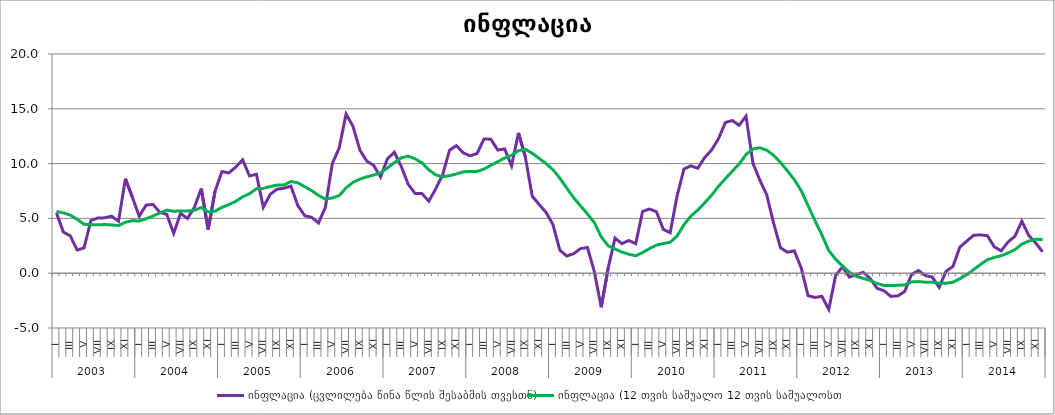
| Category | ინფლაცია (ცვლილება წინა წლის შესაბმის თვესთნ) | ინფლაცია (12 თვის საშუალო 12 თვის საშუალოსთნ) |
|---|---|---|
| 0 | 5.507 | 5.643 |
| 1 | 3.75 | 5.503 |
| 2 | 3.406 | 5.303 |
| 3 | 2.114 | 4.919 |
| 4 | 2.307 | 4.468 |
| 5 | 4.812 | 4.412 |
| 6 | 5.032 | 4.409 |
| 7 | 5.051 | 4.44 |
| 8 | 5.203 | 4.407 |
| 9 | 4.738 | 4.353 |
| 10 | 8.622 | 4.652 |
| 11 | 6.953 | 4.785 |
| 12 | 5.198 | 4.762 |
| 13 | 6.211 | 4.97 |
| 14 | 6.274 | 5.21 |
| 15 | 5.556 | 5.5 |
| 16 | 5.366 | 5.756 |
| 17 | 3.637 | 5.652 |
| 18 | 5.453 | 5.685 |
| 19 | 4.993 | 5.678 |
| 20 | 6.006 | 5.743 |
| 21 | 7.718 | 5.989 |
| 22 | 3.982 | 5.603 |
| 23 | 7.483 | 5.656 |
| 24 | 9.276 | 6.008 |
| 25 | 9.151 | 6.264 |
| 26 | 9.681 | 6.558 |
| 27 | 10.341 | 6.964 |
| 28 | 8.872 | 7.257 |
| 29 | 9.03 | 7.699 |
| 30 | 6.014 | 7.736 |
| 31 | 7.202 | 7.909 |
| 32 | 7.668 | 8.04 |
| 33 | 7.753 | 8.041 |
| 34 | 7.94 | 8.368 |
| 35 | 6.179 | 8.247 |
| 36 | 5.247 | 7.894 |
| 37 | 5.1 | 7.543 |
| 38 | 4.58 | 7.106 |
| 39 | 6.012 | 6.75 |
| 40 | 10 | 6.863 |
| 41 | 11.417 | 7.081 |
| 42 | 14.519 | 7.781 |
| 43 | 13.407 | 8.292 |
| 44 | 11.24 | 8.588 |
| 45 | 10.229 | 8.793 |
| 46 | 9.839 | 8.95 |
| 47 | 8.778 | 9.161 |
| 48 | 10.438 | 9.597 |
| 49 | 11.037 | 10.095 |
| 50 | 9.747 | 10.522 |
| 51 | 8.122 | 10.685 |
| 52 | 7.281 | 10.437 |
| 53 | 7.263 | 10.079 |
| 54 | 6.574 | 9.429 |
| 55 | 7.699 | 8.974 |
| 56 | 8.969 | 8.798 |
| 57 | 11.218 | 8.895 |
| 58 | 11.64 | 9.057 |
| 59 | 10.975 | 9.245 |
| 60 | 10.707 | 9.279 |
| 61 | 10.919 | 9.283 |
| 62 | 12.25 | 9.503 |
| 63 | 12.224 | 9.846 |
| 64 | 11.235 | 10.174 |
| 65 | 11.337 | 10.508 |
| 66 | 9.804 | 10.764 |
| 67 | 12.799 | 11.182 |
| 68 | 10.605 | 11.308 |
| 69 | 7.02 | 10.938 |
| 70 | 6.267 | 10.471 |
| 71 | 5.548 | 9.999 |
| 72 | 4.441 | 9.447 |
| 73 | 2.094 | 8.674 |
| 74 | 1.572 | 7.765 |
| 75 | 1.785 | 6.892 |
| 76 | 2.242 | 6.143 |
| 77 | 2.347 | 5.409 |
| 78 | 0.141 | 4.621 |
| 79 | -3.106 | 3.318 |
| 80 | 0.44 | 2.508 |
| 81 | 3.203 | 2.209 |
| 82 | 2.697 | 1.927 |
| 83 | 2.986 | 1.728 |
| 84 | 2.693 | 1.589 |
| 85 | 5.633 | 1.886 |
| 86 | 5.858 | 2.242 |
| 87 | 5.612 | 2.561 |
| 88 | 4.006 | 2.709 |
| 89 | 3.689 | 2.822 |
| 90 | 7.048 | 3.383 |
| 91 | 9.512 | 4.43 |
| 92 | 9.794 | 5.213 |
| 93 | 9.576 | 5.753 |
| 94 | 10.542 | 6.417 |
| 95 | 11.241 | 7.111 |
| 96 | 12.26 | 7.923 |
| 97 | 13.747 | 8.617 |
| 98 | 13.936 | 9.3 |
| 99 | 13.499 | 9.961 |
| 100 | 14.332 | 10.824 |
| 101 | 10.034 | 11.341 |
| 102 | 8.499 | 11.44 |
| 103 | 7.154 | 11.224 |
| 104 | 4.562 | 10.754 |
| 105 | 2.318 | 10.102 |
| 106 | 1.917 | 9.34 |
| 107 | 2.041 | 8.543 |
| 108 | 0.478 | 7.527 |
| 109 | -2.055 | 6.159 |
| 110 | -2.211 | 4.793 |
| 111 | -2.105 | 3.5 |
| 112 | -3.3 | 2.066 |
| 113 | -0.18 | 1.269 |
| 114 | 0.565 | 0.665 |
| 115 | -0.359 | 0.081 |
| 116 | -0.121 | -0.289 |
| 117 | 0.078 | -0.469 |
| 118 | -0.487 | -0.664 |
| 119 | -1.373 | -0.944 |
| 120 | -1.6 | -1.117 |
| 121 | -2.117 | -1.12 |
| 122 | -2.069 | -1.106 |
| 123 | -1.678 | -1.069 |
| 124 | -0.112 | -0.796 |
| 125 | 0.241 | -0.761 |
| 126 | -0.212 | -0.824 |
| 127 | -0.353 | -0.824 |
| 128 | -1.294 | -0.921 |
| 129 | 0.173 | -0.913 |
| 130 | 0.607 | -0.823 |
| 131 | 2.372 | -0.512 |
| 132 | 2.92 | -0.135 |
| 133 | 3.461 | 0.332 |
| 134 | 3.492 | 0.798 |
| 135 | 3.429 | 1.227 |
| 136 | 2.405 | 1.439 |
| 137 | 2.042 | 1.589 |
| 138 | 2.85 | 1.842 |
| 139 | 3.377 | 2.15 |
| 140 | 4.752 | 2.653 |
| 141 | 3.441 | 2.926 |
| 142 | 2.764 | 3.106 |
| 143 | 1.952 | 3.069 |